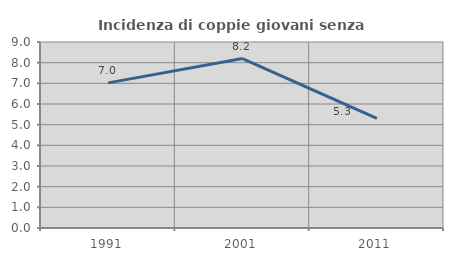
| Category | Incidenza di coppie giovani senza figli |
|---|---|
| 1991.0 | 7.022 |
| 2001.0 | 8.201 |
| 2011.0 | 5.306 |